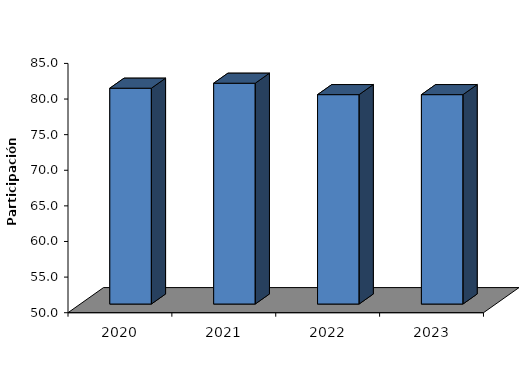
| Category | % Utilización |
|---|---|
| 2020-12-01 | 80.3 |
| 2021-12-01 | 81 |
| 2022-12-01 | 79.4 |
| 2023-12-01 | 79.4 |